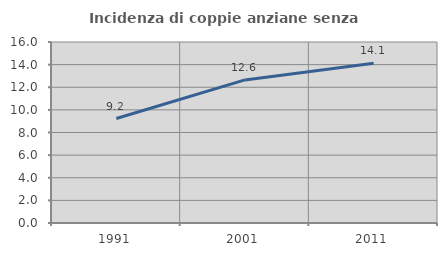
| Category | Incidenza di coppie anziane senza figli  |
|---|---|
| 1991.0 | 9.234 |
| 2001.0 | 12.648 |
| 2011.0 | 14.129 |